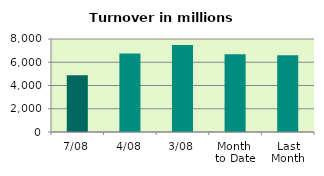
| Category | Series 0 |
|---|---|
| 7/08 | 4884.039 |
| 4/08 | 6761.528 |
| 3/08 | 7492.348 |
| Month 
to Date | 6695.834 |
| Last
Month | 6596.564 |